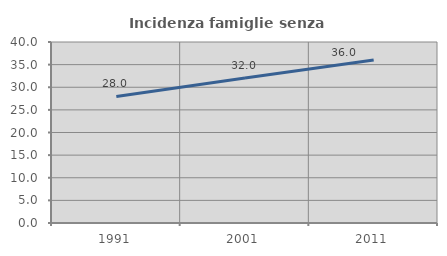
| Category | Incidenza famiglie senza nuclei |
|---|---|
| 1991.0 | 27.96 |
| 2001.0 | 32.049 |
| 2011.0 | 36.023 |